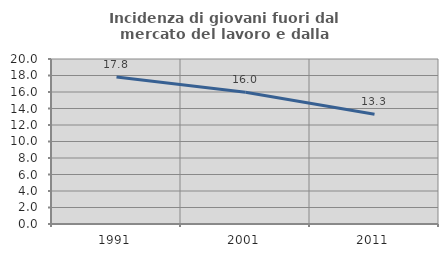
| Category | Incidenza di giovani fuori dal mercato del lavoro e dalla formazione  |
|---|---|
| 1991.0 | 17.829 |
| 2001.0 | 15.969 |
| 2011.0 | 13.293 |